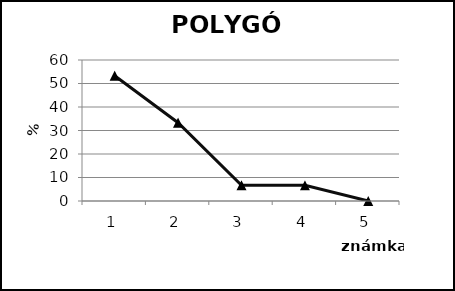
| Category | Časť žiakov v % |
|---|---|
| 0 | 53.33 |
| 1 | 33.33 |
| 2 | 6.66 |
| 3 | 6.66 |
| 4 | 0 |